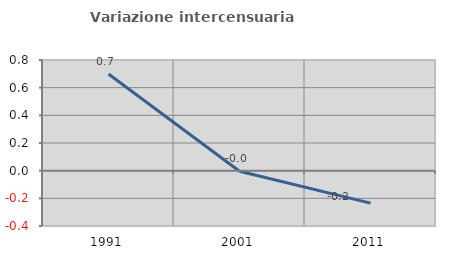
| Category | Variazione intercensuaria annua |
|---|---|
| 1991.0 | 0.699 |
| 2001.0 | -0.005 |
| 2011.0 | -0.234 |